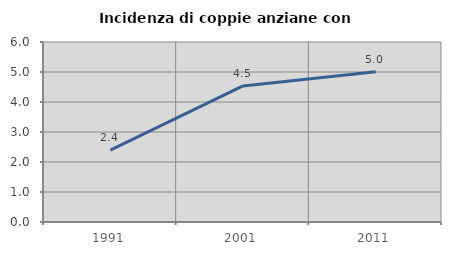
| Category | Incidenza di coppie anziane con figli |
|---|---|
| 1991.0 | 2.398 |
| 2001.0 | 4.537 |
| 2011.0 | 5.009 |